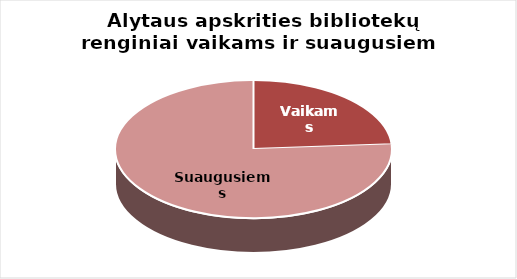
| Category | Series 0 |
|---|---|
| Vaikams | 847 |
| Suaugusiems | 2703 |